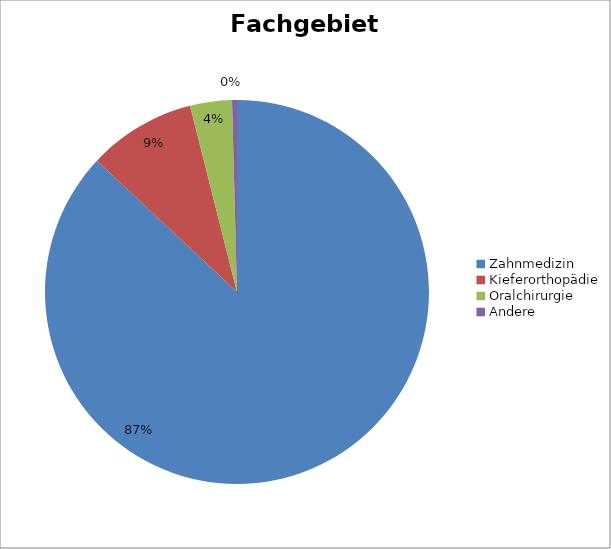
| Category | Series 0 |
|---|---|
| Zahnmedizin | 14737 |
| Kieferorthopädie | 1539 |
| Oralchirurgie | 596 |
| Andere | 70 |